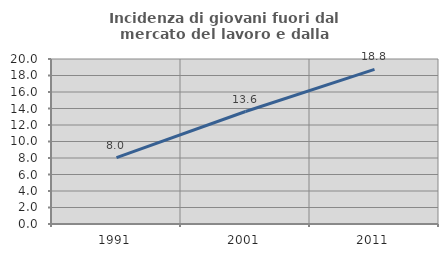
| Category | Incidenza di giovani fuori dal mercato del lavoro e dalla formazione  |
|---|---|
| 1991.0 | 8.036 |
| 2001.0 | 13.636 |
| 2011.0 | 18.75 |